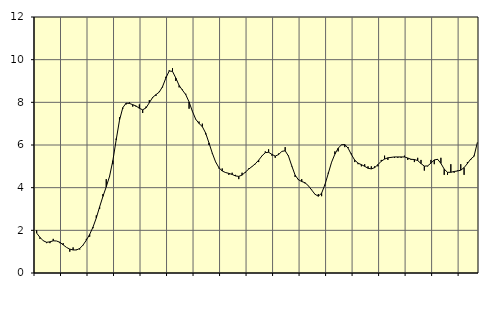
| Category | Piggar | Series 1 |
|---|---|---|
| nan | 2 | 1.87 |
| 87.0 | 1.6 | 1.67 |
| 87.0 | 1.5 | 1.51 |
| 87.0 | 1.4 | 1.44 |
| nan | 1.4 | 1.46 |
| 88.0 | 1.6 | 1.51 |
| 88.0 | 1.5 | 1.5 |
| 88.0 | 1.4 | 1.44 |
| nan | 1.4 | 1.32 |
| 89.0 | 1.2 | 1.2 |
| 89.0 | 1 | 1.12 |
| 89.0 | 1.2 | 1.08 |
| nan | 1.1 | 1.08 |
| 90.0 | 1.1 | 1.15 |
| 90.0 | 1.3 | 1.31 |
| 90.0 | 1.6 | 1.54 |
| nan | 1.7 | 1.81 |
| 91.0 | 2.1 | 2.15 |
| 91.0 | 2.7 | 2.58 |
| 91.0 | 3 | 3.1 |
| nan | 3.7 | 3.59 |
| 92.0 | 4.4 | 4.04 |
| 92.0 | 4.5 | 4.53 |
| 92.0 | 5.1 | 5.27 |
| nan | 6.3 | 6.24 |
| 93.0 | 7.3 | 7.16 |
| 93.0 | 7.7 | 7.75 |
| 93.0 | 7.9 | 7.96 |
| nan | 8 | 7.95 |
| 94.0 | 7.8 | 7.89 |
| 94.0 | 7.8 | 7.83 |
| 94.0 | 7.9 | 7.72 |
| nan | 7.5 | 7.65 |
| 95.0 | 7.8 | 7.74 |
| 95.0 | 8.1 | 7.98 |
| 95.0 | 8.2 | 8.23 |
| nan | 8.3 | 8.36 |
| 96.0 | 8.5 | 8.48 |
| 96.0 | 8.7 | 8.74 |
| 96.0 | 9.2 | 9.14 |
| nan | 9.5 | 9.47 |
| 97.0 | 9.6 | 9.45 |
| 97.0 | 9 | 9.14 |
| 97.0 | 8.7 | 8.79 |
| nan | 8.6 | 8.57 |
| 98.0 | 8.4 | 8.36 |
| 98.0 | 7.7 | 8.02 |
| 98.0 | 7.6 | 7.58 |
| nan | 7.2 | 7.21 |
| 99.0 | 7.1 | 7.01 |
| 99.0 | 7 | 6.86 |
| 99.0 | 6.5 | 6.56 |
| nan | 6 | 6.1 |
| 0.0 | 5.6 | 5.62 |
| 0.0 | 5.2 | 5.21 |
| 0.0 | 4.9 | 4.94 |
| nan | 4.9 | 4.78 |
| 1.0 | 4.7 | 4.71 |
| 1.0 | 4.6 | 4.67 |
| 1.0 | 4.7 | 4.62 |
| nan | 4.6 | 4.55 |
| 2.0 | 4.4 | 4.53 |
| 2.0 | 4.7 | 4.59 |
| 2.0 | 4.7 | 4.73 |
| nan | 4.9 | 4.87 |
| 3.0 | 5 | 4.99 |
| 3.0 | 5.1 | 5.12 |
| 3.0 | 5.2 | 5.29 |
| nan | 5.5 | 5.49 |
| 4.0 | 5.7 | 5.64 |
| 4.0 | 5.8 | 5.66 |
| 4.0 | 5.5 | 5.56 |
| nan | 5.4 | 5.48 |
| 5.0 | 5.6 | 5.55 |
| 5.0 | 5.7 | 5.7 |
| 5.0 | 5.9 | 5.73 |
| nan | 5.5 | 5.48 |
| 6.0 | 5 | 5.02 |
| 6.0 | 4.5 | 4.59 |
| 6.0 | 4.4 | 4.37 |
| nan | 4.4 | 4.29 |
| 7.0 | 4.2 | 4.23 |
| 7.0 | 4.1 | 4.09 |
| 7.0 | 3.9 | 3.89 |
| nan | 3.7 | 3.69 |
| 8.0 | 3.7 | 3.6 |
| 8.0 | 3.6 | 3.74 |
| 8.0 | 4.1 | 4.14 |
| nan | 4.7 | 4.66 |
| 9.0 | 5.2 | 5.19 |
| 9.0 | 5.7 | 5.57 |
| 9.0 | 5.7 | 5.85 |
| nan | 6 | 6.01 |
| 10.0 | 5.9 | 6.02 |
| 10.0 | 5.9 | 5.85 |
| 10.0 | 5.6 | 5.55 |
| nan | 5.2 | 5.29 |
| 11.0 | 5.1 | 5.15 |
| 11.0 | 5 | 5.08 |
| 11.0 | 5.1 | 5 |
| nan | 5 | 4.91 |
| 12.0 | 5 | 4.88 |
| 12.0 | 5 | 4.94 |
| 12.0 | 5 | 5.08 |
| nan | 5.3 | 5.24 |
| 13.0 | 5.5 | 5.34 |
| 13.0 | 5.3 | 5.4 |
| 13.0 | 5.4 | 5.42 |
| nan | 5.4 | 5.44 |
| 14.0 | 5.4 | 5.44 |
| 14.0 | 5.4 | 5.44 |
| 14.0 | 5.5 | 5.44 |
| nan | 5.3 | 5.39 |
| 15.0 | 5.3 | 5.33 |
| 15.0 | 5.2 | 5.32 |
| 15.0 | 5.4 | 5.27 |
| nan | 5.3 | 5.13 |
| 16.0 | 4.8 | 5.01 |
| 16.0 | 5 | 5.02 |
| 16.0 | 5.3 | 5.15 |
| nan | 5.1 | 5.3 |
| 17.0 | 5.3 | 5.33 |
| 17.0 | 5.4 | 5.14 |
| 17.0 | 4.6 | 4.87 |
| nan | 4.6 | 4.72 |
| 18.0 | 5.1 | 4.72 |
| 18.0 | 4.7 | 4.76 |
| 18.0 | 4.8 | 4.78 |
| nan | 5.1 | 4.82 |
| 19.0 | 4.6 | 4.94 |
| 19.0 | 5.2 | 5.13 |
| 19.0 | 5.3 | 5.34 |
| nan | 5.5 | 5.47 |
| 20.0 | 6.1 | 6.11 |